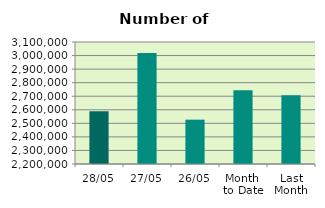
| Category | Series 0 |
|---|---|
| 28/05 | 2589064 |
| 27/05 | 3018002 |
| 26/05 | 2526936 |
| Month 
to Date | 2744650 |
| Last
Month | 2707305.9 |